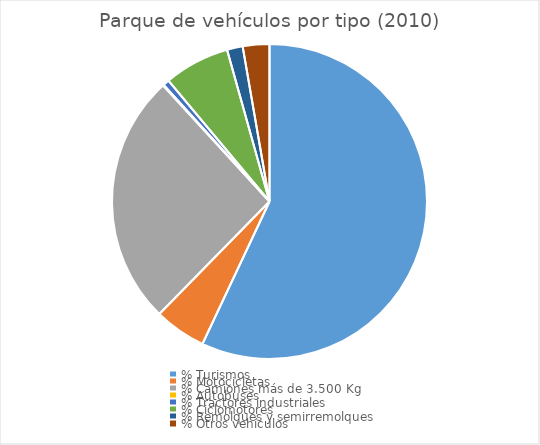
| Category | Series 0 |
|---|---|
| % Turismos | 0.57 |
| % Motocicletas | 0.053 |
| % Camiones más de 3.500 Kg | 0.259 |
| % Autobuses | 0.001 |
| % Tractores industriales | 0.006 |
| % Ciclomotores | 0.067 |
| % Remolques y semirremolques | 0.016 |
| % Otros vehículos | 0.027 |